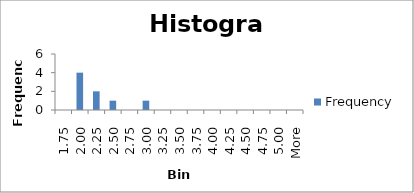
| Category | Frequency |
|---|---|
| 1.75 | 0 |
| 2.00 | 4 |
| 2.25 | 2 |
| 2.50 | 1 |
| 2.75 | 0 |
| 3.00 | 1 |
| 3.25 | 0 |
| 3.50 | 0 |
| 3.75 | 0 |
| 4.00 | 0 |
| 4.25 | 0 |
| 4.50 | 0 |
| 4.75 | 0 |
| 5.00 | 0 |
| More | 0 |